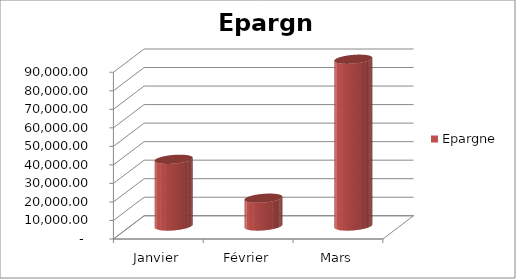
| Category | Epargne |
|---|---|
| Janvier | 36000 |
| Février | 15000 |
| Mars | 90000 |